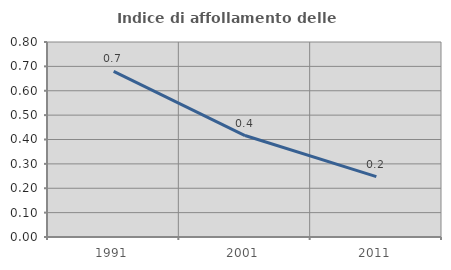
| Category | Indice di affollamento delle abitazioni  |
|---|---|
| 1991.0 | 0.68 |
| 2001.0 | 0.416 |
| 2011.0 | 0.248 |